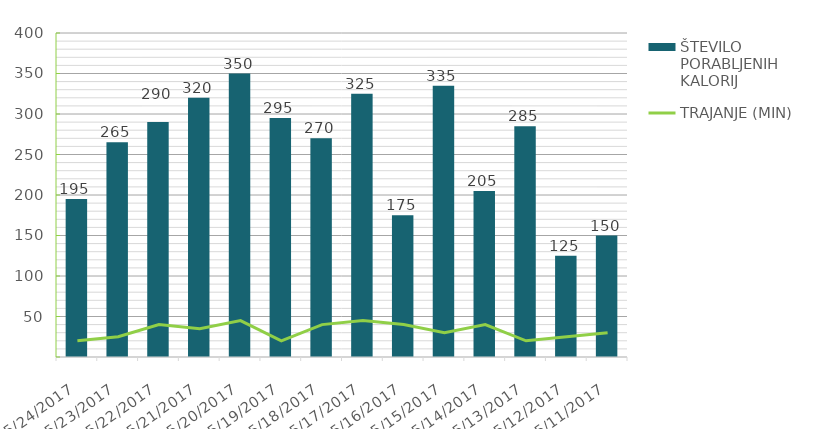
| Category | ŠTEVILO PORABLJENIH KALORIJ |
|---|---|
| 5/24/17 | 195 |
| 5/23/17 | 265 |
| 5/22/17 | 290 |
| 5/21/17 | 320 |
| 5/20/17 | 350 |
| 5/19/17 | 295 |
| 5/18/17 | 270 |
| 5/17/17 | 325 |
| 5/16/17 | 175 |
| 5/15/17 | 335 |
| 5/14/17 | 205 |
| 5/13/17 | 285 |
| 5/12/17 | 125 |
| 5/11/17 | 150 |